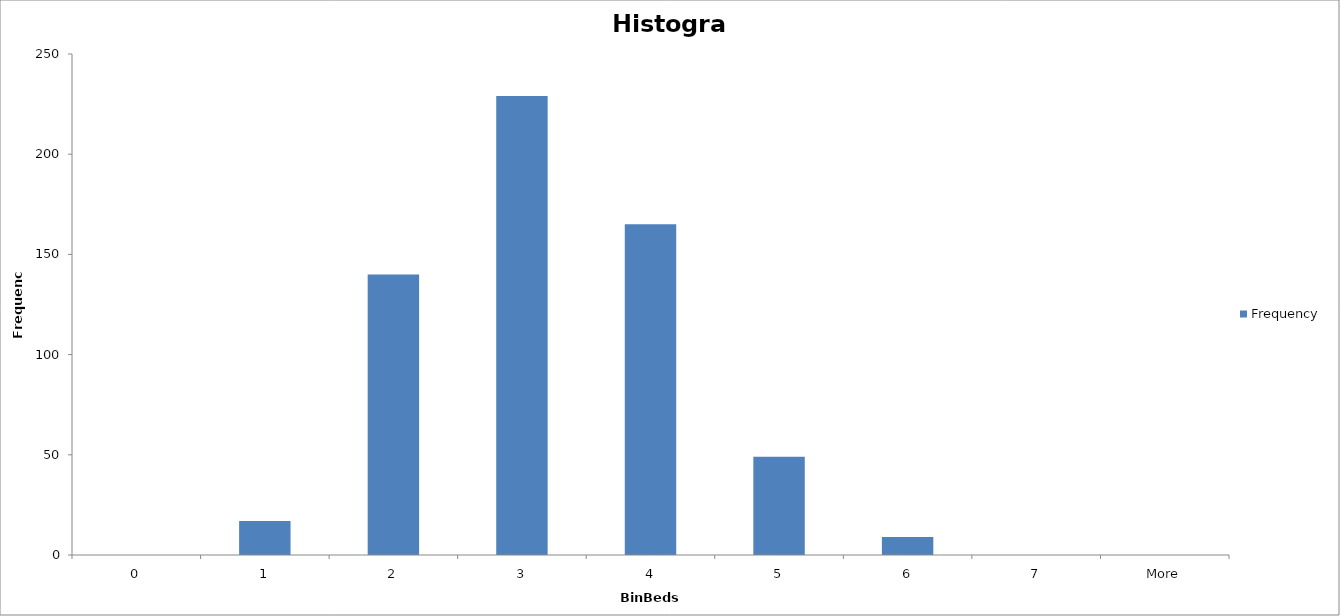
| Category | Frequency |
|---|---|
| 0 | 0 |
| 1 | 17 |
| 2 | 140 |
| 3 | 229 |
| 4 | 165 |
| 5 | 49 |
| 6 | 9 |
| 7 | 0 |
| More | 0 |